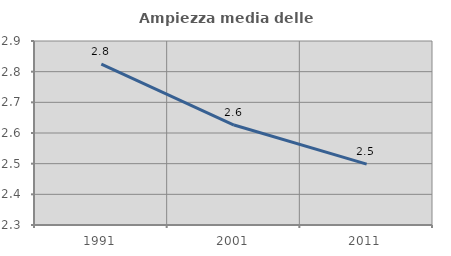
| Category | Ampiezza media delle famiglie |
|---|---|
| 1991.0 | 2.825 |
| 2001.0 | 2.626 |
| 2011.0 | 2.498 |